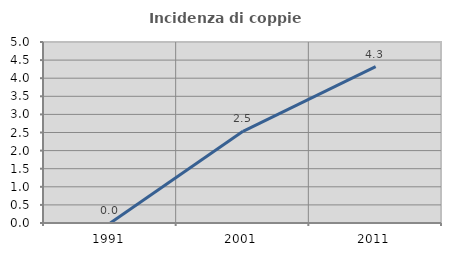
| Category | Incidenza di coppie miste |
|---|---|
| 1991.0 | 0 |
| 2001.0 | 2.532 |
| 2011.0 | 4.321 |